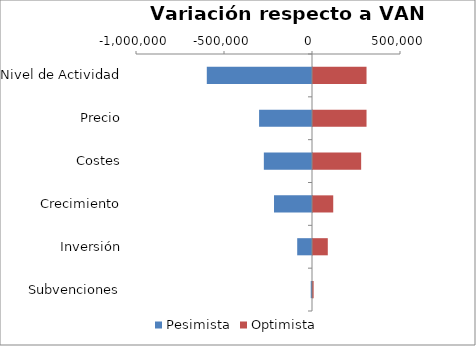
| Category | Pesimista | Optimista |
|---|---|---|
| Nivel de Actividad | -597709.477 | 304146.066 |
| Precio | -300646.183 | 304146.066 |
| Costes | -273594.962 | 273594.962 |
| Crecimiento | -215858.785 | 114961.306 |
| Inversión | -84060.991 | 84060.991 |
| Subvenciones | -7107.15 | 3553.575 |